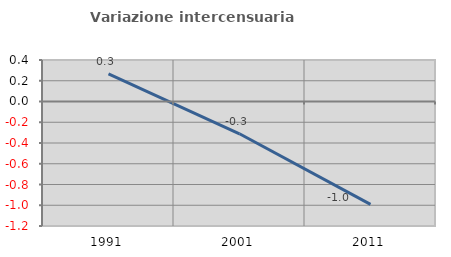
| Category | Variazione intercensuaria annua |
|---|---|
| 1991.0 | 0.266 |
| 2001.0 | -0.311 |
| 2011.0 | -0.992 |